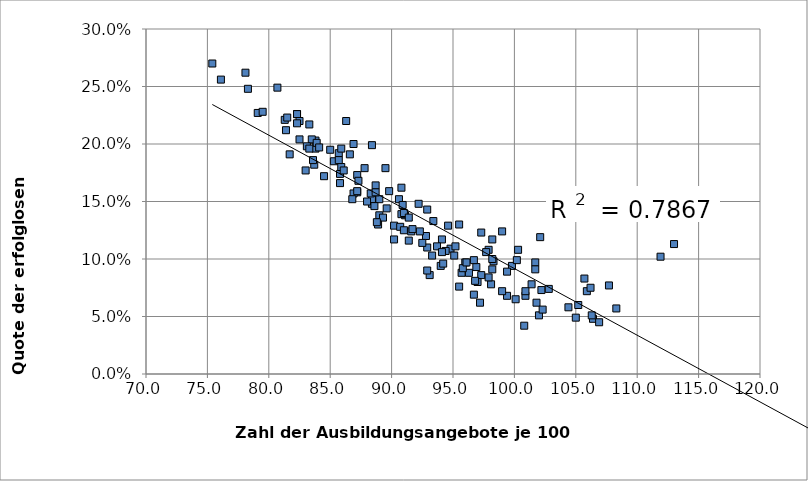
| Category | Quote erfolgloser Nachfrager |
|---|---|
| 113.0 | 0.113 |
| 92.8 | 0.12 |
| 99.8 | 0.094 |
| 101.7 | 0.097 |
| 128.9 | 0.055 |
| 97.3 | 0.123 |
| 82.3 | 0.226 |
| 83.8 | 0.203 |
| 102.1 | 0.119 |
| 97.9 | 0.108 |
| 90.8 | 0.162 |
| 90.6 | 0.152 |
| 94.8 | 0.109 |
| 96.3 | 0.088 |
| 93.1 | 0.086 |
| 102.0 | 0.051 |
| 101.4 | 0.078 |
| 91.1 | 0.138 |
| 106.4 | 0.048 |
| 86.3 | 0.22 |
| 97.2 | 0.062 |
| 100.8 | 0.042 |
| 89.0 | 0.138 |
| 90.9 | 0.147 |
| 99.0 | 0.124 |
| 105.7 | 0.083 |
| 88.4 | 0.199 |
| 98.3 | 0.098 |
| 98.1 | 0.078 |
| 100.1 | 0.065 |
| 100.3 | 0.108 |
| 96.7 | 0.069 |
| 98.2 | 0.117 |
| 111.9 | 0.102 |
| 107.7 | 0.077 |
| 89.3 | 0.136 |
| 91.6 | 0.124 |
| 83.7 | 0.182 |
| 89.0 | 0.152 |
| 85.8 | 0.166 |
| 87.2 | 0.158 |
| 89.5 | 0.179 |
| 90.2 | 0.129 |
| 88.4 | 0.148 |
| 88.4 | 0.152 |
| 83.5 | 0.204 |
| 87.8 | 0.179 |
| 82.3 | 0.226 |
| 76.1 | 0.256 |
| 88.9 | 0.13 |
| 83.3 | 0.217 |
| 81.4 | 0.212 |
| 82.5 | 0.22 |
| 86.9 | 0.157 |
| 83.8 | 0.196 |
| 88.3 | 0.157 |
| 81.3 | 0.221 |
| 92.9 | 0.09 |
| 83.9 | 0.201 |
| 89.8 | 0.159 |
| 84.1 | 0.197 |
| 86.8 | 0.152 |
| 83.1 | 0.198 |
| 88.7 | 0.164 |
| 86.6 | 0.191 |
| 93.3 | 0.103 |
| 85.3 | 0.185 |
| 87.2 | 0.159 |
| 96.9 | 0.093 |
| 90.7 | 0.128 |
| 88.8 | 0.132 |
| 78.3 | 0.248 |
| 79.1 | 0.227 |
| 83.6 | 0.186 |
| 81.7 | 0.191 |
| 86.9 | 0.2 |
| 92.9 | 0.11 |
| 82.5 | 0.204 |
| 85.0 | 0.195 |
| 81.5 | 0.223 |
| 94.0 | 0.094 |
| 79.5 | 0.228 |
| 88.6 | 0.146 |
| 75.4 | 0.27 |
| 88.7 | 0.158 |
| 88.0 | 0.15 |
| 94.1 | 0.117 |
| 85.8 | 0.174 |
| 78.1 | 0.262 |
| 95.7 | 0.088 |
| 85.9 | 0.18 |
| 97.3 | 0.086 |
| 82.3 | 0.218 |
| 86.1 | 0.177 |
| 87.2 | 0.173 |
| 83.0 | 0.177 |
| 84.5 | 0.172 |
| 80.7 | 0.249 |
| 83.3 | 0.196 |
| 95.5 | 0.13 |
| 92.3 | 0.124 |
| 87.3 | 0.168 |
| 85.7 | 0.192 |
| 95.5 | 0.076 |
| 91.4 | 0.116 |
| 89.6 | 0.144 |
| 85.7 | 0.186 |
| 85.9 | 0.196 |
| 90.8 | 0.139 |
| 92.5 | 0.114 |
| 94.2 | 0.096 |
| 94.4 | 0.107 |
| 98.2 | 0.1 |
| 92.9 | 0.143 |
| 96.0 | 0.097 |
| 92.2 | 0.148 |
| 91.7 | 0.126 |
| 95.1 | 0.103 |
| 100.9 | 0.068 |
| 95.8 | 0.092 |
| 99.4 | 0.068 |
| 97.0 | 0.08 |
| 94.6 | 0.129 |
| 90.2 | 0.117 |
| 95.2 | 0.111 |
| 91.0 | 0.14 |
| 91.4 | 0.136 |
| 96.1 | 0.097 |
| 101.8 | 0.062 |
| 93.7 | 0.111 |
| 101.7 | 0.091 |
| 94.1 | 0.106 |
| 98.2 | 0.091 |
| 97.9 | 0.084 |
| 93.4 | 0.133 |
| 97.7 | 0.106 |
| 105.9 | 0.072 |
| 106.9 | 0.045 |
| 99.4 | 0.089 |
| 96.8 | 0.081 |
| 100.2 | 0.099 |
| 96.7 | 0.099 |
| 102.3 | 0.056 |
| 102.2 | 0.073 |
| 105.2 | 0.06 |
| 99.0 | 0.072 |
| 102.8 | 0.074 |
| 106.3 | 0.051 |
| 104.4 | 0.058 |
| 108.3 | 0.057 |
| 100.9 | 0.072 |
| 105.0 | 0.049 |
| 106.2 | 0.075 |
| 91.0 | 0.125 |